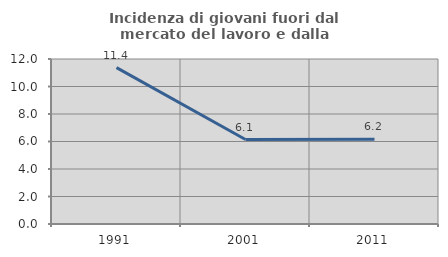
| Category | Incidenza di giovani fuori dal mercato del lavoro e dalla formazione  |
|---|---|
| 1991.0 | 11.374 |
| 2001.0 | 6.145 |
| 2011.0 | 6.171 |